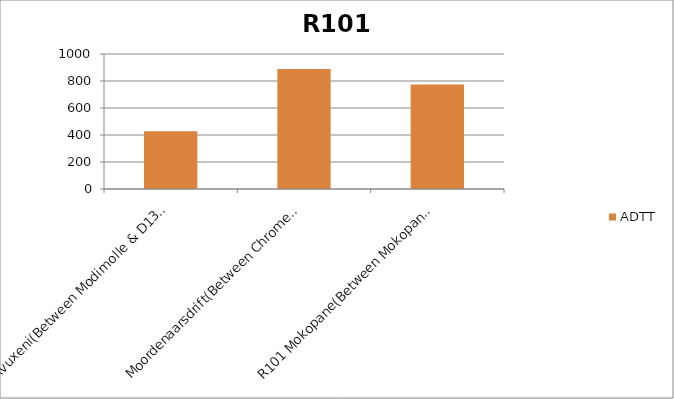
| Category | ADTT |
|---|---|
| Avuxeni(Between Modimolle & D1359 T/O) | 427.351 |
| Moordenaarsdrift(Between Chromemine T/O and N11 Roedtan T/O) | 888.701 |
| R101 Mokopane(Between Mokopane (Potgietersrus) & Polokwane) | 774.452 |